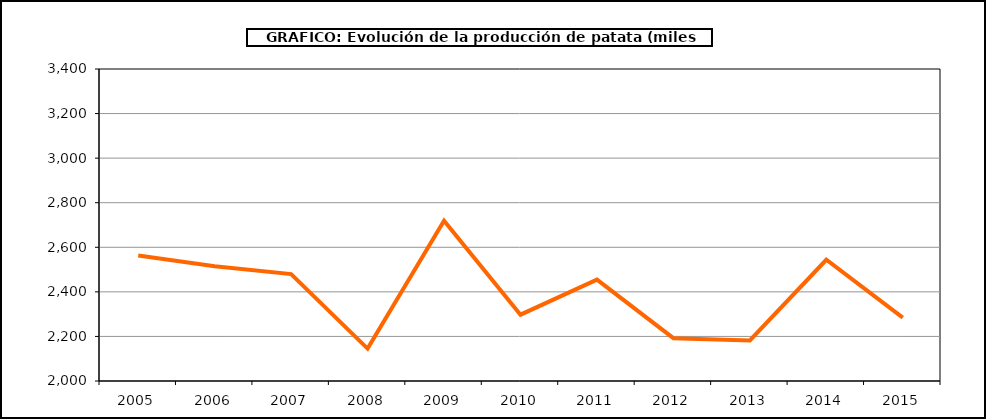
| Category | Producción |
|---|---|
| 2005.0 | 2563.464 |
| 2006.0 | 2515.001 |
| 2007.0 | 2479.582 |
| 2008.0 | 2145.171 |
| 2009.0 | 2719.291 |
| 2010.0 | 2297.649 |
| 2011.0 | 2455.101 |
| 2012.0 | 2192.284 |
| 2013.0 | 2182.082 |
| 2014.0 | 2544.009 |
| 2015.0 | 2284.073 |